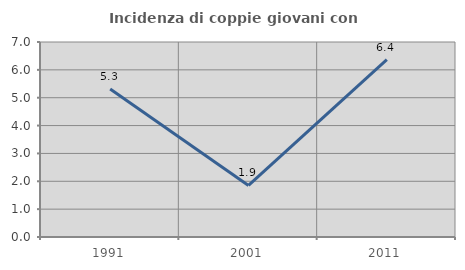
| Category | Incidenza di coppie giovani con figli |
|---|---|
| 1991.0 | 5.31 |
| 2001.0 | 1.852 |
| 2011.0 | 6.364 |